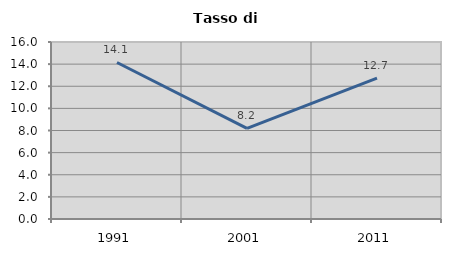
| Category | Tasso di disoccupazione   |
|---|---|
| 1991.0 | 14.148 |
| 2001.0 | 8.197 |
| 2011.0 | 12.731 |